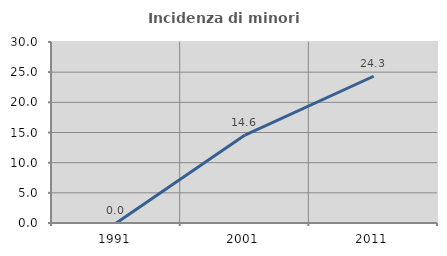
| Category | Incidenza di minori stranieri |
|---|---|
| 1991.0 | 0 |
| 2001.0 | 14.583 |
| 2011.0 | 24.324 |